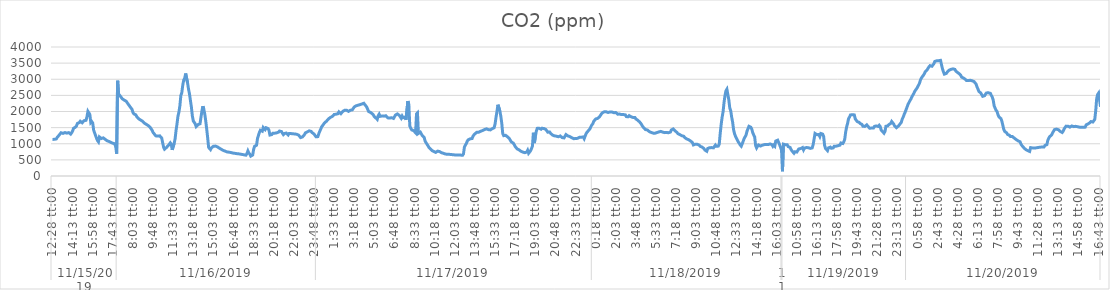
| Category | CO2 (ppm) |
|---|---|
| 0 | 1133.2 |
| 1900-01-01 | 1136.1 |
| 1900-01-02 | 1137.6 |
| 1900-01-03 | 1145.1 |
| 1900-01-04 | 1149.9 |
| 1900-01-05 | 1200 |
| 1900-01-06 | 1201.9 |
| 1900-01-07 | 1268.7 |
| 1900-01-08 | 1309.3 |
| 1900-01-09 | 1341.6 |
| 1900-01-10 | 1341.9 |
| 1900-01-11 | 1321.1 |
| 1900-01-12 | 1323.6 |
| 1900-01-13 | 1347.5 |
| 1900-01-14 | 1345.2 |
| 1900-01-15 | 1330.1 |
| 1900-01-16 | 1309.6 |
| 1900-01-17 | 1344.7 |
| 1900-01-18 | 1334.2 |
| 1900-01-19 | 1299 |
| 1900-01-20 | 1340.5 |
| 1900-01-21 | 1396.4 |
| 1900-01-22 | 1478.6 |
| 1900-01-23 | 1490.3 |
| 1900-01-24 | 1514.3 |
| 1900-01-25 | 1549.4 |
| 1900-01-26 | 1627.8 |
| 1900-01-27 | 1648.3 |
| 1900-01-28 | 1655.9 |
| 1900-01-29 | 1698.3 |
| 1900-01-30 | 1697.4 |
| 1900-01-31 | 1650.7 |
| 1900-02-01 | 1662.3 |
| 1900-02-02 | 1715.8 |
| 1900-02-03 | 1738.5 |
| 1900-02-04 | 1727.6 |
| 1900-02-05 | 1835.6 |
| 1900-02-06 | 2004.4 |
| 1900-02-07 | 1997.2 |
| 1900-02-08 | 1909 |
| 1900-02-09 | 1655.4 |
| 1900-02-10 | 1688.2 |
| 1900-02-11 | 1642.8 |
| 1900-02-12 | 1417.3 |
| 1900-02-13 | 1393.5 |
| 1900-02-14 | 1253.7 |
| 1900-02-15 | 1168.8 |
| 1900-02-16 | 1099.2 |
| 1900-02-17 | 1058.3 |
| 1900-02-18 | 1210.2 |
| 1900-02-19 | 1209 |
| 1900-02-20 | 1162.9 |
| 1900-02-21 | 1185.4 |
| 1900-02-22 | 1182.8 |
| 1900-02-23 | 1164.2 |
| 1900-02-24 | 1138 |
| 1900-02-25 | 1119.6 |
| 1900-02-26 | 1092.8 |
| 1900-02-27 | 1087.5 |
| 1900-02-28 | 1071.2 |
| 1900-02-28 | 1055 |
| 1900-03-01 | 1041.6 |
| 1900-03-02 | 1028.4 |
| 1900-03-03 | 1015.6 |
| 1900-03-04 | 1008.6 |
| 1900-03-05 | 1000.5 |
| 1900-03-06 | 909 |
| 1900-03-07 | 691.6 |
| 1900-03-08 | 2954.5 |
| 1900-03-09 | 2548.3 |
| 1900-03-10 | 2531.4 |
| 1900-03-11 | 2467.6 |
| 1900-03-12 | 2426.9 |
| 1900-03-13 | 2390.5 |
| 1900-03-14 | 2373.7 |
| 1900-03-15 | 2351.6 |
| 1900-03-16 | 2336 |
| 1900-03-17 | 2317.9 |
| 1900-03-18 | 2271.3 |
| 1900-03-19 | 2255 |
| 1900-03-20 | 2188.8 |
| 1900-03-21 | 2148 |
| 1900-03-22 | 2135.9 |
| 1900-03-23 | 2068.2 |
| 1900-03-24 | 1971.4 |
| 1900-03-25 | 1924.6 |
| 1900-03-26 | 1911.1 |
| 1900-03-27 | 1895.4 |
| 1900-03-28 | 1838.2 |
| 1900-03-29 | 1823.3 |
| 1900-03-30 | 1772.9 |
| 1900-03-31 | 1751.6 |
| 1900-04-01 | 1734.9 |
| 1900-04-02 | 1715 |
| 1900-04-03 | 1698.9 |
| 1900-04-04 | 1670.8 |
| 1900-04-05 | 1637.8 |
| 1900-04-06 | 1622.6 |
| 1900-04-07 | 1600.5 |
| 1900-04-08 | 1582 |
| 1900-04-09 | 1562.1 |
| 1900-04-10 | 1540.7 |
| 1900-04-11 | 1507 |
| 1900-04-12 | 1476.4 |
| 1900-04-13 | 1417.2 |
| 1900-04-14 | 1351 |
| 1900-04-15 | 1314 |
| 1900-04-16 | 1274.7 |
| 1900-04-17 | 1243.5 |
| 1900-04-18 | 1241.8 |
| 1900-04-19 | 1238.6 |
| 1900-04-20 | 1244.2 |
| 1900-04-21 | 1244.8 |
| 1900-04-22 | 1219.1 |
| 1900-04-23 | 1176.5 |
| 1900-04-24 | 1034.3 |
| 1900-04-25 | 890.8 |
| 1900-04-26 | 831.9 |
| 1900-04-27 | 848.8 |
| 1900-04-28 | 885.2 |
| 1900-04-29 | 916 |
| 1900-04-30 | 949.3 |
| 1900-05-01 | 979.6 |
| 1900-05-02 | 1028.4 |
| 1900-05-03 | 986 |
| 1900-05-04 | 810.9 |
| 1900-05-05 | 810 |
| 1900-05-06 | 1013.7 |
| 1900-05-07 | 1150.9 |
| 1900-05-08 | 1412.1 |
| 1900-05-09 | 1618.4 |
| 1900-05-10 | 1854.8 |
| 1900-05-11 | 1983.8 |
| 1900-05-12 | 2179.9 |
| 1900-05-13 | 2497.4 |
| 1900-05-14 | 2585.4 |
| 1900-05-15 | 2815.9 |
| 1900-05-16 | 2976.4 |
| 1900-05-17 | 3025.6 |
| 1900-05-18 | 3178.9 |
| 1900-05-19 | 3160.9 |
| 1900-05-20 | 2887.4 |
| 1900-05-21 | 2699.1 |
| 1900-05-22 | 2549.2 |
| 1900-05-23 | 2342.2 |
| 1900-05-24 | 2138.2 |
| 1900-05-25 | 1865.1 |
| 1900-05-26 | 1707.5 |
| 1900-05-27 | 1662.6 |
| 1900-05-28 | 1617.8 |
| 1900-05-29 | 1532.1 |
| 1900-05-30 | 1551.7 |
| 1900-05-31 | 1595.5 |
| 1900-06-01 | 1620 |
| 1900-06-02 | 1619.3 |
| 1900-06-03 | 1818.7 |
| 1900-06-04 | 2022.2 |
| 1900-06-05 | 2164.8 |
| 1900-06-06 | 2065.9 |
| 1900-06-07 | 1914.8 |
| 1900-06-08 | 1702.2 |
| 1900-06-09 | 1452.6 |
| 1900-06-10 | 1186.7 |
| 1900-06-11 | 885.5 |
| 1900-06-12 | 869.5 |
| 1900-06-13 | 817.9 |
| 1900-06-14 | 874.3 |
| 1900-06-15 | 865.9 |
| 1900-06-16 | 922.1 |
| 1900-06-17 | 925.8 |
| 1900-06-18 | 927.7 |
| 1900-06-19 | 922.3 |
| 1900-06-20 | 906.4 |
| 1900-06-21 | 892.4 |
| 1900-06-22 | 867.3 |
| 1900-06-23 | 849.4 |
| 1900-06-24 | 831.5 |
| 1900-06-25 | 812 |
| 1900-06-26 | 796.9 |
| 1900-06-27 | 785.5 |
| 1900-06-28 | 773.7 |
| 1900-06-29 | 769 |
| 1900-06-30 | 748.5 |
| 1900-07-01 | 744.8 |
| 1900-07-02 | 739.5 |
| 1900-07-03 | 738.5 |
| 1900-07-04 | 730.1 |
| 1900-07-05 | 715.4 |
| 1900-07-06 | 713.6 |
| 1900-07-07 | 709.3 |
| 1900-07-08 | 704.1 |
| 1900-07-09 | 698.8 |
| 1900-07-10 | 694.4 |
| 1900-07-11 | 691.3 |
| 1900-07-12 | 689.3 |
| 1900-07-13 | 689.4 |
| 1900-07-14 | 678.8 |
| 1900-07-15 | 669.2 |
| 1900-07-16 | 667.4 |
| 1900-07-17 | 663.2 |
| 1900-07-18 | 657.1 |
| 1900-07-19 | 649.4 |
| 1900-07-20 | 645.8 |
| 1900-07-21 | 695.9 |
| 1900-07-22 | 777.9 |
| 1900-07-23 | 709.8 |
| 1900-07-24 | 677.2 |
| 1900-07-25 | 616.5 |
| 1900-07-26 | 604.2 |
| 1900-07-27 | 650.9 |
| 1900-07-28 | 828 |
| 1900-07-29 | 921.3 |
| 1900-07-30 | 936 |
| 1900-07-31 | 954.6 |
| 1900-08-01 | 1161.6 |
| 1900-08-02 | 1258.1 |
| 1900-08-03 | 1351.2 |
| 1900-08-04 | 1418 |
| 1900-08-05 | 1443.6 |
| 1900-08-06 | 1388.9 |
| 1900-08-07 | 1504.9 |
| 1900-08-08 | 1502.9 |
| 1900-08-09 | 1439.6 |
| 1900-08-10 | 1496.8 |
| 1900-08-11 | 1504.7 |
| 1900-08-12 | 1472.4 |
| 1900-08-13 | 1413.3 |
| 1900-08-14 | 1270.1 |
| 1900-08-15 | 1286.2 |
| 1900-08-16 | 1286 |
| 1900-08-17 | 1328.6 |
| 1900-08-18 | 1359.6 |
| 1900-08-19 | 1327.6 |
| 1900-08-20 | 1298.2 |
| 1900-08-21 | 1337.2 |
| 1900-08-22 | 1336.7 |
| 1900-08-23 | 1360.9 |
| 1900-08-24 | 1394 |
| 1900-08-25 | 1377.7 |
| 1900-08-26 | 1379.8 |
| 1900-08-27 | 1327.2 |
| 1900-08-28 | 1284.7 |
| 1900-08-29 | 1316.5 |
| 1900-08-30 | 1334.2 |
| 1900-08-31 | 1330.9 |
| 1900-09-01 | 1330.9 |
| 1900-09-02 | 1271.1 |
| 1900-09-03 | 1318.3 |
| 1900-09-04 | 1318.9 |
| 1900-09-05 | 1315.1 |
| 1900-09-06 | 1303.3 |
| 1900-09-07 | 1306.8 |
| 1900-09-08 | 1309.4 |
| 1900-09-09 | 1305.3 |
| 1900-09-10 | 1298.7 |
| 1900-09-11 | 1293.4 |
| 1900-09-12 | 1267.1 |
| 1900-09-13 | 1265.8 |
| 1900-09-14 | 1251.8 |
| 1900-09-15 | 1191.3 |
| 1900-09-16 | 1172.3 |
| 1900-09-17 | 1212.3 |
| 1900-09-18 | 1242.4 |
| 1900-09-19 | 1281.4 |
| 1900-09-20 | 1337.9 |
| 1900-09-21 | 1365.5 |
| 1900-09-22 | 1368.9 |
| 1900-09-23 | 1381.2 |
| 1900-09-24 | 1399 |
| 1900-09-25 | 1387.2 |
| 1900-09-26 | 1382.9 |
| 1900-09-27 | 1346.6 |
| 1900-09-28 | 1316.6 |
| 1900-09-29 | 1301.7 |
| 1900-09-30 | 1272.1 |
| 1900-10-01 | 1218.2 |
| 1900-10-02 | 1196.3 |
| 1900-10-03 | 1220.6 |
| 1900-10-04 | 1314.3 |
| 1900-10-05 | 1386.9 |
| 1900-10-06 | 1450.5 |
| 1900-10-07 | 1526.4 |
| 1900-10-08 | 1564.1 |
| 1900-10-09 | 1606.4 |
| 1900-10-10 | 1647.6 |
| 1900-10-11 | 1667.9 |
| 1900-10-12 | 1697.9 |
| 1900-10-13 | 1702.5 |
| 1900-10-14 | 1767.7 |
| 1900-10-15 | 1787.2 |
| 1900-10-16 | 1813.9 |
| 1900-10-17 | 1829.2 |
| 1900-10-18 | 1845 |
| 1900-10-19 | 1871.7 |
| 1900-10-20 | 1907 |
| 1900-10-21 | 1925.6 |
| 1900-10-22 | 1916.9 |
| 1900-10-23 | 1939.1 |
| 1900-10-24 | 1932 |
| 1900-10-25 | 1988.1 |
| 1900-10-26 | 1989 |
| 1900-10-27 | 1931.9 |
| 1900-10-28 | 1933.3 |
| 1900-10-29 | 2003.4 |
| 1900-10-30 | 2005 |
| 1900-10-31 | 2038.2 |
| 1900-11-01 | 2036.3 |
| 1900-11-02 | 2040.8 |
| 1900-11-03 | 2048.4 |
| 1900-11-04 | 2003.1 |
| 1900-11-05 | 2026.3 |
| 1900-11-06 | 2040.3 |
| 1900-11-07 | 2040.6 |
| 1900-11-08 | 2050.6 |
| 1900-11-09 | 2060.3 |
| 1900-11-10 | 2141.2 |
| 1900-11-11 | 2167.8 |
| 1900-11-12 | 2178 |
| 1900-11-13 | 2185.2 |
| 1900-11-14 | 2195.3 |
| 1900-11-15 | 2195.2 |
| 1900-11-16 | 2212.3 |
| 1900-11-17 | 2211.5 |
| 1900-11-18 | 2232.4 |
| 1900-11-19 | 2246.6 |
| 1900-11-20 | 2255 |
| 1900-11-21 | 2245 |
| 1900-11-22 | 2179.4 |
| 1900-11-23 | 2138.7 |
| 1900-11-24 | 2070.2 |
| 1900-11-25 | 1998.8 |
| 1900-11-26 | 1979.2 |
| 1900-11-27 | 1971.7 |
| 1900-11-28 | 1955.2 |
| 1900-11-29 | 1926.2 |
| 1900-11-30 | 1890 |
| 1900-12-01 | 1837.9 |
| 1900-12-02 | 1829 |
| 1900-12-03 | 1787.7 |
| 1900-12-04 | 1756.5 |
| 1900-12-05 | 1868.6 |
| 1900-12-06 | 1917.6 |
| 1900-12-07 | 1849.2 |
| 1900-12-08 | 1858.5 |
| 1900-12-09 | 1861.2 |
| 1900-12-10 | 1855.1 |
| 1900-12-11 | 1856.1 |
| 1900-12-12 | 1866.8 |
| 1900-12-13 | 1868.3 |
| 1900-12-14 | 1859.5 |
| 1900-12-15 | 1802.3 |
| 1900-12-16 | 1797.5 |
| 1900-12-17 | 1798.3 |
| 1900-12-18 | 1810.1 |
| 1900-12-19 | 1806.6 |
| 1900-12-20 | 1791.5 |
| 1900-12-21 | 1784.9 |
| 1900-12-22 | 1756.2 |
| 1900-12-23 | 1889.7 |
| 1900-12-24 | 1907.3 |
| 1900-12-25 | 1925.2 |
| 1900-12-26 | 1926.1 |
| 1900-12-27 | 1880.9 |
| 1900-12-28 | 1851.1 |
| 1900-12-29 | 1791.8 |
| 1900-12-30 | 1858.2 |
| 1900-12-31 | 1807.7 |
| 1901-01-01 | 1791.6 |
| 1901-01-02 | 1827 |
| 1901-01-03 | 1743 |
| 1901-01-04 | 1732.3 |
| 1901-01-05 | 2322.7 |
| 1901-01-06 | 2208.4 |
| 1901-01-07 | 1550 |
| 1901-01-08 | 1484.9 |
| 1901-01-09 | 1429.3 |
| 1901-01-10 | 1433.3 |
| 1901-01-11 | 1406.2 |
| 1901-01-12 | 1380.2 |
| 1901-01-13 | 1341.2 |
| 1901-01-14 | 1926.4 |
| 1901-01-15 | 1957.5 |
| 1901-01-16 | 1319.6 |
| 1901-01-17 | 1345.7 |
| 1901-01-18 | 1359.6 |
| 1901-01-19 | 1354.1 |
| 1901-01-20 | 1253.9 |
| 1901-01-21 | 1261.7 |
| 1901-01-22 | 1194 |
| 1901-01-23 | 1081.2 |
| 1901-01-24 | 1028.4 |
| 1901-01-25 | 1001 |
| 1901-01-26 | 937 |
| 1901-01-27 | 882.1 |
| 1901-01-28 | 852.4 |
| 1901-01-29 | 828.8 |
| 1901-01-30 | 793.1 |
| 1901-01-31 | 772.6 |
| 1901-02-01 | 760.6 |
| 1901-02-02 | 747.8 |
| 1901-02-03 | 732.2 |
| 1901-02-04 | 717.4 |
| 1901-02-05 | 770.8 |
| 1901-02-06 | 768.3 |
| 1901-02-07 | 758.7 |
| 1901-02-08 | 738.2 |
| 1901-02-09 | 722.5 |
| 1901-02-10 | 716.2 |
| 1901-02-11 | 704.9 |
| 1901-02-12 | 696.4 |
| 1901-02-13 | 683.1 |
| 1901-02-14 | 680.3 |
| 1901-02-15 | 671.5 |
| 1901-02-16 | 671.1 |
| 1901-02-17 | 672.3 |
| 1901-02-18 | 667.8 |
| 1901-02-19 | 666.8 |
| 1901-02-20 | 656.4 |
| 1901-02-21 | 659.6 |
| 1901-02-22 | 660 |
| 1901-02-23 | 653.3 |
| 1901-02-24 | 646.8 |
| 1901-02-25 | 648.4 |
| 1901-02-26 | 650.8 |
| 1901-02-27 | 653.1 |
| 1901-02-28 | 649.8 |
| 1901-03-01 | 648.4 |
| 1901-03-02 | 645.4 |
| 1901-03-03 | 641.6 |
| 1901-03-04 | 681.9 |
| 1901-03-05 | 894.3 |
| 1901-03-06 | 957.4 |
| 1901-03-07 | 1007.3 |
| 1901-03-08 | 1082.3 |
| 1901-03-09 | 1122.7 |
| 1901-03-10 | 1137.5 |
| 1901-03-11 | 1153 |
| 1901-03-12 | 1156.1 |
| 1901-03-13 | 1161.3 |
| 1901-03-14 | 1237.2 |
| 1901-03-15 | 1276.7 |
| 1901-03-16 | 1307.8 |
| 1901-03-17 | 1306.4 |
| 1901-03-18 | 1356.7 |
| 1901-03-19 | 1357.2 |
| 1901-03-20 | 1357.7 |
| 1901-03-21 | 1373.2 |
| 1901-03-22 | 1387.9 |
| 1901-03-23 | 1401.4 |
| 1901-03-24 | 1409.9 |
| 1901-03-25 | 1420.8 |
| 1901-03-26 | 1440.9 |
| 1901-03-27 | 1450.5 |
| 1901-03-28 | 1462.2 |
| 1901-03-29 | 1453.1 |
| 1901-03-30 | 1438.4 |
| 1901-03-31 | 1443.9 |
| 1901-04-01 | 1429 |
| 1901-04-02 | 1448.2 |
| 1901-04-03 | 1467.4 |
| 1901-04-04 | 1477.6 |
| 1901-04-05 | 1496.4 |
| 1901-04-06 | 1613.9 |
| 1901-04-07 | 1819.2 |
| 1901-04-08 | 2001.8 |
| 1901-04-09 | 2210.5 |
| 1901-04-10 | 2203.2 |
| 1901-04-11 | 2017.4 |
| 1901-04-12 | 1853.8 |
| 1901-04-13 | 1633.3 |
| 1901-04-14 | 1316.1 |
| 1901-04-15 | 1251.5 |
| 1901-04-16 | 1238.7 |
| 1901-04-17 | 1260.7 |
| 1901-04-18 | 1241.6 |
| 1901-04-19 | 1215.2 |
| 1901-04-20 | 1203.4 |
| 1901-04-21 | 1156.6 |
| 1901-04-22 | 1103.9 |
| 1901-04-23 | 1056.3 |
| 1901-04-24 | 1048.9 |
| 1901-04-25 | 1020.2 |
| 1901-04-26 | 971.1 |
| 1901-04-27 | 913.5 |
| 1901-04-28 | 884 |
| 1901-04-29 | 842.8 |
| 1901-04-30 | 812.6 |
| 1901-05-01 | 811.1 |
| 1901-05-02 | 791.7 |
| 1901-05-03 | 767.5 |
| 1901-05-04 | 752.8 |
| 1901-05-05 | 741.9 |
| 1901-05-06 | 737.9 |
| 1901-05-07 | 723.3 |
| 1901-05-08 | 717.5 |
| 1901-05-09 | 742.5 |
| 1901-05-10 | 797.8 |
| 1901-05-11 | 704.9 |
| 1901-05-12 | 719 |
| 1901-05-13 | 779.7 |
| 1901-05-14 | 848.3 |
| 1901-05-15 | 926.9 |
| 1901-05-16 | 1340.6 |
| 1901-05-17 | 1019.9 |
| 1901-05-18 | 1209.9 |
| 1901-05-19 | 1387.7 |
| 1901-05-20 | 1477.2 |
| 1901-05-21 | 1491 |
| 1901-05-22 | 1479.5 |
| 1901-05-23 | 1469.4 |
| 1901-05-24 | 1450.8 |
| 1901-05-25 | 1481.9 |
| 1901-05-26 | 1485 |
| 1901-05-27 | 1471.2 |
| 1901-05-28 | 1444 |
| 1901-05-29 | 1442.9 |
| 1901-05-30 | 1436.8 |
| 1901-05-31 | 1358.8 |
| 1901-06-01 | 1363.2 |
| 1901-06-02 | 1363.6 |
| 1901-06-03 | 1322.9 |
| 1901-06-04 | 1320.2 |
| 1901-06-05 | 1268.5 |
| 1901-06-06 | 1247.4 |
| 1901-06-07 | 1245 |
| 1901-06-08 | 1266.8 |
| 1901-06-09 | 1235.3 |
| 1901-06-10 | 1239.7 |
| 1901-06-11 | 1216.8 |
| 1901-06-12 | 1214.4 |
| 1901-06-13 | 1241.9 |
| 1901-06-14 | 1236.8 |
| 1901-06-15 | 1191.6 |
| 1901-06-16 | 1166.7 |
| 1901-06-17 | 1181.4 |
| 1901-06-18 | 1187.7 |
| 1901-06-19 | 1285.1 |
| 1901-06-20 | 1286.5 |
| 1901-06-21 | 1241.7 |
| 1901-06-22 | 1244.2 |
| 1901-06-23 | 1223.4 |
| 1901-06-24 | 1192.7 |
| 1901-06-25 | 1187.6 |
| 1901-06-26 | 1160 |
| 1901-06-27 | 1157.3 |
| 1901-06-28 | 1153.1 |
| 1901-06-29 | 1161.2 |
| 1901-06-30 | 1161.2 |
| 1901-07-01 | 1167.4 |
| 1901-07-02 | 1177 |
| 1901-07-03 | 1199.2 |
| 1901-07-04 | 1202.6 |
| 1901-07-05 | 1202.6 |
| 1901-07-06 | 1208.9 |
| 1901-07-07 | 1212 |
| 1901-07-08 | 1157 |
| 1901-07-09 | 1235.3 |
| 1901-07-10 | 1309 |
| 1901-07-11 | 1359.7 |
| 1901-07-12 | 1386.7 |
| 1901-07-13 | 1423.3 |
| 1901-07-14 | 1464.2 |
| 1901-07-15 | 1526.9 |
| 1901-07-16 | 1586.2 |
| 1901-07-17 | 1617.8 |
| 1901-07-18 | 1695.9 |
| 1901-07-19 | 1718.3 |
| 1901-07-20 | 1767.5 |
| 1901-07-21 | 1787.1 |
| 1901-07-22 | 1785.6 |
| 1901-07-23 | 1800.6 |
| 1901-07-24 | 1834.8 |
| 1901-07-25 | 1878.4 |
| 1901-07-26 | 1926.4 |
| 1901-07-27 | 1960.2 |
| 1901-07-28 | 1986.4 |
| 1901-07-29 | 1992.8 |
| 1901-07-30 | 1996.3 |
| 1901-07-31 | 1990.9 |
| 1901-08-01 | 1971.5 |
| 1901-08-02 | 1968.8 |
| 1901-08-03 | 1988.5 |
| 1901-08-04 | 1987 |
| 1901-08-05 | 1990.7 |
| 1901-08-06 | 1982.9 |
| 1901-08-07 | 1973.8 |
| 1901-08-08 | 1962.8 |
| 1901-08-09 | 1985.3 |
| 1901-08-10 | 1968.7 |
| 1901-08-11 | 1949.6 |
| 1901-08-12 | 1917.6 |
| 1901-08-13 | 1903.3 |
| 1901-08-14 | 1919.8 |
| 1901-08-15 | 1919.2 |
| 1901-08-16 | 1905 |
| 1901-08-17 | 1906.4 |
| 1901-08-18 | 1904.7 |
| 1901-08-19 | 1902.7 |
| 1901-08-20 | 1895.8 |
| 1901-08-21 | 1841.3 |
| 1901-08-22 | 1823.2 |
| 1901-08-23 | 1838.1 |
| 1901-08-24 | 1872.2 |
| 1901-08-25 | 1860.6 |
| 1901-08-26 | 1835.6 |
| 1901-08-27 | 1820.8 |
| 1901-08-28 | 1814.2 |
| 1901-08-29 | 1820.1 |
| 1901-08-30 | 1815.1 |
| 1901-08-31 | 1767 |
| 1901-09-01 | 1760.6 |
| 1901-09-02 | 1729.1 |
| 1901-09-03 | 1705.6 |
| 1901-09-04 | 1672 |
| 1901-09-05 | 1637.4 |
| 1901-09-06 | 1590.5 |
| 1901-09-07 | 1538.3 |
| 1901-09-08 | 1504.1 |
| 1901-09-09 | 1488.2 |
| 1901-09-10 | 1438.5 |
| 1901-09-11 | 1442.6 |
| 1901-09-12 | 1427 |
| 1901-09-13 | 1406.2 |
| 1901-09-14 | 1377.3 |
| 1901-09-15 | 1354.5 |
| 1901-09-16 | 1350.1 |
| 1901-09-17 | 1349.5 |
| 1901-09-18 | 1329.2 |
| 1901-09-19 | 1325.6 |
| 1901-09-20 | 1326.8 |
| 1901-09-21 | 1351.8 |
| 1901-09-22 | 1348 |
| 1901-09-23 | 1357.9 |
| 1901-09-24 | 1366.8 |
| 1901-09-25 | 1371.8 |
| 1901-09-26 | 1382.7 |
| 1901-09-27 | 1362.3 |
| 1901-09-28 | 1360.8 |
| 1901-09-29 | 1347.3 |
| 1901-09-30 | 1344.6 |
| 1901-10-01 | 1355.3 |
| 1901-10-02 | 1349.5 |
| 1901-10-03 | 1339.3 |
| 1901-10-04 | 1340.7 |
| 1901-10-05 | 1348.8 |
| 1901-10-06 | 1360.7 |
| 1901-10-07 | 1426 |
| 1901-10-08 | 1455.2 |
| 1901-10-09 | 1460.4 |
| 1901-10-10 | 1437.1 |
| 1901-10-11 | 1400.8 |
| 1901-10-12 | 1375.9 |
| 1901-10-13 | 1343.3 |
| 1901-10-14 | 1310.8 |
| 1901-10-15 | 1290.8 |
| 1901-10-16 | 1280.2 |
| 1901-10-17 | 1260.1 |
| 1901-10-18 | 1249.1 |
| 1901-10-19 | 1243.6 |
| 1901-10-20 | 1230.1 |
| 1901-10-21 | 1191.8 |
| 1901-10-22 | 1169 |
| 1901-10-23 | 1149.5 |
| 1901-10-24 | 1137.1 |
| 1901-10-25 | 1126.4 |
| 1901-10-26 | 1116.8 |
| 1901-10-27 | 1086.6 |
| 1901-10-28 | 1070.6 |
| 1901-10-29 | 1037.5 |
| 1901-10-30 | 963.6 |
| 1901-10-31 | 987.4 |
| 1901-11-01 | 987.6 |
| 1901-11-02 | 983.5 |
| 1901-11-03 | 984.4 |
| 1901-11-04 | 967.5 |
| 1901-11-05 | 958.5 |
| 1901-11-06 | 923.4 |
| 1901-11-07 | 915.1 |
| 1901-11-08 | 896.7 |
| 1901-11-09 | 883.7 |
| 1901-11-10 | 852.4 |
| 1901-11-11 | 806.4 |
| 1901-11-12 | 786.7 |
| 1901-11-13 | 767.1 |
| 1901-11-14 | 852.9 |
| 1901-11-15 | 880.4 |
| 1901-11-16 | 878.8 |
| 1901-11-17 | 883.4 |
| 1901-11-18 | 880.3 |
| 1901-11-19 | 855.8 |
| 1901-11-20 | 873.1 |
| 1901-11-21 | 875.1 |
| 1901-11-22 | 959 |
| 1901-11-23 | 920 |
| 1901-11-24 | 920.5 |
| 1901-11-25 | 927.1 |
| 1901-11-26 | 988.5 |
| 1901-11-27 | 1313.4 |
| 1901-11-28 | 1596.9 |
| 1901-11-29 | 1820.6 |
| 1901-11-30 | 1988.4 |
| 1901-12-01 | 2278.3 |
| 1901-12-02 | 2494.2 |
| 1901-12-03 | 2643.3 |
| 1901-12-04 | 2691.8 |
| 1901-12-05 | 2677.7 |
| 1901-12-06 | 2356.9 |
| 1901-12-07 | 2108.2 |
| 1901-12-08 | 2019.7 |
| 1901-12-09 | 1822.2 |
| 1901-12-10 | 1665.5 |
| 1901-12-11 | 1430 |
| 1901-12-12 | 1309.3 |
| 1901-12-13 | 1229.1 |
| 1901-12-14 | 1165.4 |
| 1901-12-15 | 1111.5 |
| 1901-12-16 | 1051 |
| 1901-12-17 | 1009.2 |
| 1901-12-18 | 957.1 |
| 1901-12-19 | 924.5 |
| 1901-12-20 | 998.8 |
| 1901-12-21 | 1001.1 |
| 1901-12-22 | 1161.9 |
| 1901-12-23 | 1157 |
| 1901-12-24 | 1269.4 |
| 1901-12-25 | 1390.8 |
| 1901-12-26 | 1421.4 |
| 1901-12-27 | 1540.3 |
| 1901-12-28 | 1554 |
| 1901-12-29 | 1511.2 |
| 1901-12-30 | 1449.6 |
| 1901-12-31 | 1340.8 |
| 1902-01-01 | 1271.7 |
| 1902-01-02 | 1206.9 |
| 1902-01-03 | 942.6 |
| 1902-01-04 | 870.3 |
| 1902-01-05 | 922.5 |
| 1902-01-06 | 962.9 |
| 1902-01-07 | 959.1 |
| 1902-01-08 | 928.3 |
| 1902-01-09 | 924 |
| 1902-01-10 | 954.5 |
| 1902-01-11 | 954.9 |
| 1902-01-12 | 972.9 |
| 1902-01-13 | 974.9 |
| 1902-01-14 | 980.3 |
| 1902-01-15 | 981.2 |
| 1902-01-16 | 974.5 |
| 1902-01-17 | 984.1 |
| 1902-01-18 | 994.2 |
| 1902-01-19 | 995.4 |
| 1902-01-20 | 971.9 |
| 1902-01-21 | 920.3 |
| 1902-01-22 | 961.2 |
| 1902-01-23 | 926.7 |
| 1902-01-24 | 1084.6 |
| 1902-01-25 | 1091.5 |
| 1902-01-26 | 1111 |
| 1902-01-27 | 1106.3 |
| 1902-01-28 | 970.8 |
| 1902-01-29 | 888.8 |
| 1902-01-30 | 802.2 |
| 1902-01-31 | 144.6 |
| 1902-02-01 | 987.9 |
| 1902-02-02 | 972.5 |
| 1902-02-03 | 968.3 |
| 1902-02-04 | 977.9 |
| 1902-02-05 | 966.5 |
| 1902-02-06 | 911.3 |
| 1902-02-07 | 905.8 |
| 1902-02-08 | 884.7 |
| 1902-02-09 | 820.5 |
| 1902-02-10 | 774 |
| 1902-02-11 | 773.7 |
| 1902-02-12 | 706.3 |
| 1902-02-13 | 751.5 |
| 1902-02-14 | 762.8 |
| 1902-02-15 | 742.5 |
| 1902-02-16 | 790.7 |
| 1902-02-17 | 837 |
| 1902-02-18 | 839.1 |
| 1902-02-19 | 851.2 |
| 1902-02-20 | 881.2 |
| 1902-02-21 | 881.6 |
| 1902-02-22 | 809.2 |
| 1902-02-23 | 866.2 |
| 1902-02-24 | 881.9 |
| 1902-02-25 | 881.7 |
| 1902-02-26 | 881.8 |
| 1902-02-27 | 878.5 |
| 1902-02-28 | 867.3 |
| 1902-03-01 | 855.7 |
| 1902-03-02 | 854.4 |
| 1902-03-03 | 871.8 |
| 1902-03-04 | 970.1 |
| 1902-03-05 | 982.8 |
| 1902-03-06 | 1318.9 |
| 1902-03-07 | 1298.6 |
| 1902-03-08 | 1281.2 |
| 1902-03-09 | 1295 |
| 1902-03-10 | 1286.2 |
| 1902-03-11 | 1224.4 |
| 1902-03-12 | 1318.3 |
| 1902-03-13 | 1305.5 |
| 1902-03-14 | 1297.8 |
| 1902-03-15 | 1223.7 |
| 1902-03-16 | 946.3 |
| 1902-03-17 | 852 |
| 1902-03-18 | 822.4 |
| 1902-03-19 | 786.4 |
| 1902-03-20 | 871.1 |
| 1902-03-21 | 895.4 |
| 1902-03-22 | 895.9 |
| 1902-03-23 | 860.5 |
| 1902-03-24 | 862.9 |
| 1902-03-25 | 871 |
| 1902-03-26 | 925.4 |
| 1902-03-27 | 925.8 |
| 1902-03-28 | 925.5 |
| 1902-03-29 | 928 |
| 1902-03-30 | 940.3 |
| 1902-03-31 | 939.5 |
| 1902-04-01 | 956.3 |
| 1902-04-02 | 1024.1 |
| 1902-04-03 | 1022.2 |
| 1902-04-04 | 1006.8 |
| 1902-04-05 | 1057 |
| 1902-04-06 | 1143.4 |
| 1902-04-07 | 1368.1 |
| 1902-04-08 | 1526.5 |
| 1902-04-09 | 1633.1 |
| 1902-04-10 | 1780.3 |
| 1902-04-11 | 1829 |
| 1902-04-12 | 1893.7 |
| 1902-04-13 | 1907.5 |
| 1902-04-14 | 1901.7 |
| 1902-04-15 | 1872.1 |
| 1902-04-16 | 1894.9 |
| 1902-04-17 | 1770.2 |
| 1902-04-18 | 1745.6 |
| 1902-04-19 | 1688.8 |
| 1902-04-20 | 1662.3 |
| 1902-04-21 | 1662.9 |
| 1902-04-22 | 1630.7 |
| 1902-04-23 | 1633.4 |
| 1902-04-24 | 1598.2 |
| 1902-04-25 | 1541.7 |
| 1902-04-26 | 1534.8 |
| 1902-04-27 | 1537.7 |
| 1902-04-28 | 1549.8 |
| 1902-04-29 | 1585.7 |
| 1902-04-30 | 1571.6 |
| 1902-05-01 | 1516.3 |
| 1902-05-02 | 1481 |
| 1902-05-03 | 1487.5 |
| 1902-05-04 | 1486.9 |
| 1902-05-05 | 1468 |
| 1902-05-06 | 1488.9 |
| 1902-05-07 | 1539 |
| 1902-05-08 | 1564.6 |
| 1902-05-09 | 1552.3 |
| 1902-05-10 | 1546.6 |
| 1902-05-11 | 1536.9 |
| 1902-05-12 | 1572.9 |
| 1902-05-13 | 1534.8 |
| 1902-05-14 | 1426.5 |
| 1902-05-15 | 1420.6 |
| 1902-05-16 | 1361.1 |
| 1902-05-17 | 1327.3 |
| 1902-05-18 | 1382.1 |
| 1902-05-19 | 1541.7 |
| 1902-05-20 | 1567.2 |
| 1902-05-21 | 1555.9 |
| 1902-05-22 | 1591.4 |
| 1902-05-23 | 1596.2 |
| 1902-05-24 | 1632.2 |
| 1902-05-25 | 1689.3 |
| 1902-05-26 | 1666.3 |
| 1902-05-27 | 1615.5 |
| 1902-05-28 | 1555.1 |
| 1902-05-29 | 1542.2 |
| 1902-05-30 | 1498.6 |
| 1902-05-31 | 1476.8 |
| 1902-06-01 | 1549.3 |
| 1902-06-02 | 1585.6 |
| 1902-06-03 | 1596.8 |
| 1902-06-04 | 1662.7 |
| 1902-06-05 | 1764.3 |
| 1902-06-06 | 1823.6 |
| 1902-06-07 | 1908 |
| 1902-06-08 | 1973.6 |
| 1902-06-09 | 2055.4 |
| 1902-06-10 | 2132.4 |
| 1902-06-11 | 2218.9 |
| 1902-06-12 | 2273 |
| 1902-06-13 | 2334.2 |
| 1902-06-14 | 2381.6 |
| 1902-06-15 | 2448.1 |
| 1902-06-16 | 2503.7 |
| 1902-06-17 | 2553.9 |
| 1902-06-18 | 2620.5 |
| 1902-06-19 | 2668 |
| 1902-06-20 | 2704.6 |
| 1902-06-21 | 2757.7 |
| 1902-06-22 | 2814.5 |
| 1902-06-23 | 2872.7 |
| 1902-06-24 | 2972.1 |
| 1902-06-25 | 3035.5 |
| 1902-06-26 | 3081.6 |
| 1902-06-27 | 3117.4 |
| 1902-06-28 | 3164.7 |
| 1902-06-29 | 3231.4 |
| 1902-06-30 | 3255.1 |
| 1902-07-01 | 3290.4 |
| 1902-07-02 | 3343.3 |
| 1902-07-03 | 3386.3 |
| 1902-07-04 | 3422.1 |
| 1902-07-05 | 3425.1 |
| 1902-07-06 | 3403 |
| 1902-07-07 | 3428.9 |
| 1902-07-08 | 3478.4 |
| 1902-07-09 | 3550.8 |
| 1902-07-10 | 3551.9 |
| 1902-07-11 | 3570.6 |
| 1902-07-12 | 3575.9 |
| 1902-07-13 | 3576.1 |
| 1902-07-14 | 3586.8 |
| 1902-07-15 | 3586 |
| 1902-07-16 | 3449.8 |
| 1902-07-17 | 3326.8 |
| 1902-07-18 | 3232.4 |
| 1902-07-19 | 3158.6 |
| 1902-07-20 | 3144.8 |
| 1902-07-21 | 3179.7 |
| 1902-07-22 | 3223.3 |
| 1902-07-23 | 3248.1 |
| 1902-07-24 | 3281.7 |
| 1902-07-25 | 3293.1 |
| 1902-07-26 | 3307.9 |
| 1902-07-27 | 3323.3 |
| 1902-07-28 | 3321.8 |
| 1902-07-29 | 3320.4 |
| 1902-07-30 | 3305.7 |
| 1902-07-31 | 3253 |
| 1902-08-01 | 3240.5 |
| 1902-08-02 | 3204.2 |
| 1902-08-03 | 3176.2 |
| 1902-08-04 | 3160.5 |
| 1902-08-05 | 3125.8 |
| 1902-08-06 | 3066.2 |
| 1902-08-07 | 3071.6 |
| 1902-08-08 | 3038.2 |
| 1902-08-09 | 3011.6 |
| 1902-08-10 | 2992.4 |
| 1902-08-11 | 2960.9 |
| 1902-08-12 | 2968.1 |
| 1902-08-13 | 2957.8 |
| 1902-08-14 | 2965.1 |
| 1902-08-15 | 2967.7 |
| 1902-08-16 | 2962.5 |
| 1902-08-17 | 2952.2 |
| 1902-08-18 | 2926.7 |
| 1902-08-19 | 2927.6 |
| 1902-08-20 | 2889 |
| 1902-08-21 | 2854.9 |
| 1902-08-22 | 2770.3 |
| 1902-08-23 | 2698.8 |
| 1902-08-24 | 2625.5 |
| 1902-08-25 | 2603.1 |
| 1902-08-26 | 2571.8 |
| 1902-08-27 | 2521.1 |
| 1902-08-28 | 2470.8 |
| 1902-08-29 | 2468.1 |
| 1902-08-30 | 2490.3 |
| 1902-08-31 | 2539.6 |
| 1902-09-01 | 2576.8 |
| 1902-09-02 | 2579 |
| 1902-09-03 | 2579.8 |
| 1902-09-04 | 2568.9 |
| 1902-09-05 | 2562.9 |
| 1902-09-06 | 2499.7 |
| 1902-09-07 | 2448.9 |
| 1902-09-08 | 2352.8 |
| 1902-09-09 | 2172.6 |
| 1902-09-10 | 2169.1 |
| 1902-09-11 | 2035.6 |
| 1902-09-12 | 1998.5 |
| 1902-09-13 | 1898.5 |
| 1902-09-14 | 1831.8 |
| 1902-09-15 | 1811.6 |
| 1902-09-16 | 1782.4 |
| 1902-09-17 | 1701.5 |
| 1902-09-18 | 1575.8 |
| 1902-09-19 | 1446.9 |
| 1902-09-20 | 1383.2 |
| 1902-09-21 | 1355.2 |
| 1902-09-22 | 1337.4 |
| 1902-09-23 | 1287.9 |
| 1902-09-24 | 1270.1 |
| 1902-09-25 | 1261.5 |
| 1902-09-26 | 1222.6 |
| 1902-09-27 | 1230.3 |
| 1902-09-28 | 1223.5 |
| 1902-09-29 | 1195.8 |
| 1902-09-30 | 1174.2 |
| 1902-10-01 | 1175.1 |
| 1902-10-02 | 1128.3 |
| 1902-10-03 | 1116.8 |
| 1902-10-04 | 1088.1 |
| 1902-10-05 | 1100.6 |
| 1902-10-06 | 1062.7 |
| 1902-10-07 | 988.2 |
| 1902-10-08 | 942.8 |
| 1902-10-09 | 910.4 |
| 1902-10-10 | 874.8 |
| 1902-10-11 | 847.5 |
| 1902-10-12 | 817.3 |
| 1902-10-13 | 804.7 |
| 1902-10-14 | 787.2 |
| 1902-10-15 | 784 |
| 1902-10-16 | 761.1 |
| 1902-10-17 | 880.6 |
| 1902-10-18 | 877.1 |
| 1902-10-19 | 870.7 |
| 1902-10-20 | 868.6 |
| 1902-10-21 | 867.7 |
| 1902-10-22 | 871.3 |
| 1902-10-23 | 873.3 |
| 1902-10-24 | 875.5 |
| 1902-10-25 | 884.6 |
| 1902-10-26 | 889.4 |
| 1902-10-27 | 893.7 |
| 1902-10-28 | 898.4 |
| 1902-10-29 | 899 |
| 1902-10-30 | 895.9 |
| 1902-10-31 | 900 |
| 1902-11-01 | 947.4 |
| 1902-11-02 | 941.5 |
| 1902-11-03 | 973.5 |
| 1902-11-04 | 1108.7 |
| 1902-11-05 | 1174.5 |
| 1902-11-06 | 1222.5 |
| 1902-11-07 | 1244.7 |
| 1902-11-08 | 1275.7 |
| 1902-11-09 | 1342 |
| 1902-11-10 | 1390.1 |
| 1902-11-11 | 1439 |
| 1902-11-12 | 1444.9 |
| 1902-11-13 | 1453.2 |
| 1902-11-14 | 1453.3 |
| 1902-11-15 | 1435.6 |
| 1902-11-16 | 1416.9 |
| 1902-11-17 | 1382.9 |
| 1902-11-18 | 1361.4 |
| 1902-11-19 | 1349.2 |
| 1902-11-20 | 1387.6 |
| 1902-11-21 | 1458.8 |
| 1902-11-22 | 1504 |
| 1902-11-23 | 1546 |
| 1902-11-24 | 1548.6 |
| 1902-11-25 | 1544.3 |
| 1902-11-26 | 1519.9 |
| 1902-11-27 | 1516.4 |
| 1902-11-28 | 1517.2 |
| 1902-11-29 | 1552 |
| 1902-11-30 | 1553 |
| 1902-12-01 | 1531.7 |
| 1902-12-02 | 1539.8 |
| 1902-12-03 | 1539.9 |
| 1902-12-04 | 1533.3 |
| 1902-12-05 | 1529.2 |
| 1902-12-06 | 1511.4 |
| 1902-12-07 | 1514.4 |
| 1902-12-08 | 1518.8 |
| 1902-12-09 | 1510.1 |
| 1902-12-10 | 1498.5 |
| 1902-12-11 | 1509.7 |
| 1902-12-12 | 1510.9 |
| 1902-12-13 | 1514.6 |
| 1902-12-14 | 1585.2 |
| 1902-12-15 | 1602.2 |
| 1902-12-16 | 1613.5 |
| 1902-12-17 | 1626.3 |
| 1902-12-18 | 1656.8 |
| 1902-12-19 | 1688.3 |
| 1902-12-20 | 1688.4 |
| 1902-12-21 | 1673.9 |
| 1902-12-22 | 1679.9 |
| 1902-12-23 | 1755.4 |
| 1902-12-24 | 2024.4 |
| 1902-12-25 | 2407 |
| 1902-12-26 | 2527.9 |
| 1902-12-27 | 2571.3 |
| 1902-12-28 | 2566.6 |
| 1902-12-29 | 2147.1 |